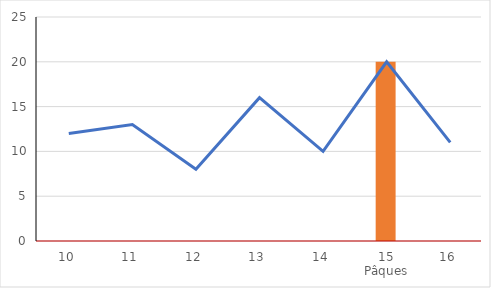
| Category | Series 1 |
|---|---|
| 10 | 0 |
| 11 | 0 |
| 12 | 0 |
| 13 | 0 |
| 14 | 0 |
| 15 Pâques | 20 |
| 16 | 0 |